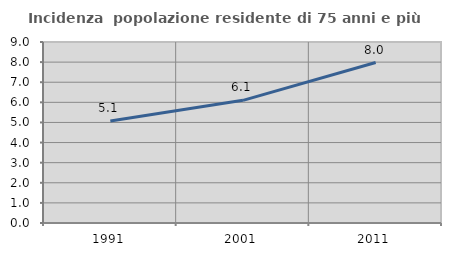
| Category | Incidenza  popolazione residente di 75 anni e più |
|---|---|
| 1991.0 | 5.073 |
| 2001.0 | 6.099 |
| 2011.0 | 7.979 |